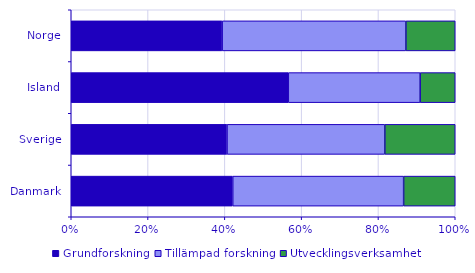
| Category | Grundforskning | Tillämpad forskning | Utvecklingsverksamhet |
|---|---|---|---|
| 0 | 9723 | 10290 | 3108 |
| 1 | 17432.656 | 17665.273 | 7882.36 |
| 2 | 11240 | 6828 | 1817 |
| 3 | 9292 | 11315 | 3039 |